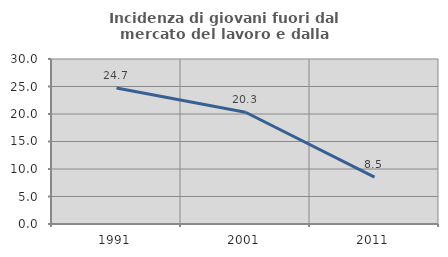
| Category | Incidenza di giovani fuori dal mercato del lavoro e dalla formazione  |
|---|---|
| 1991.0 | 24.742 |
| 2001.0 | 20.312 |
| 2011.0 | 8.511 |